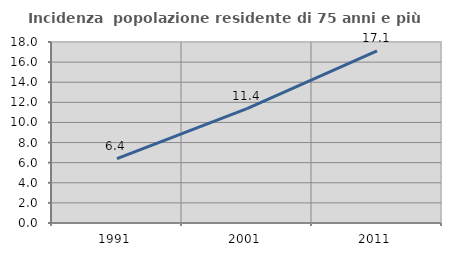
| Category | Incidenza  popolazione residente di 75 anni e più |
|---|---|
| 1991.0 | 6.398 |
| 2001.0 | 11.379 |
| 2011.0 | 17.125 |